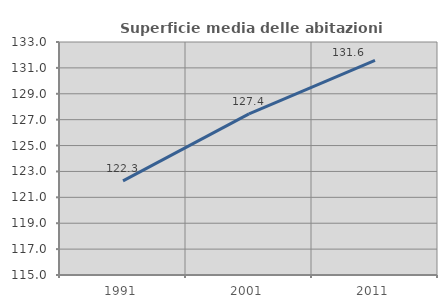
| Category | Superficie media delle abitazioni occupate |
|---|---|
| 1991.0 | 122.27 |
| 2001.0 | 127.444 |
| 2011.0 | 131.588 |